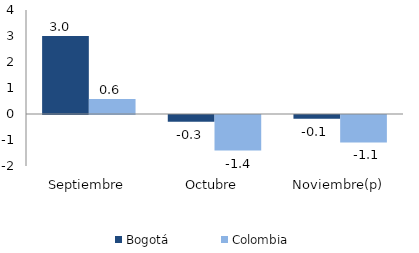
| Category | Bogotá | Colombia |
|---|---|---|
| Septiembre | 2.998 | 0.579 |
| Octubre | -0.259 | -1.37 |
| Noviembre(p) | -0.149 | -1.054 |